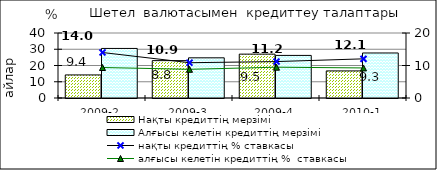
| Category | Нақты кредиттің мерзімі  | Алғысы келетін кредиттің мерзімі  |
|---|---|---|
| 2009-2 | 14.2 | 30.5 |
| 2009-3 | 23 | 24.73 |
| 2009-4 | 27 | 26.21 |
| 2010-1 | 16.67 | 27.71 |